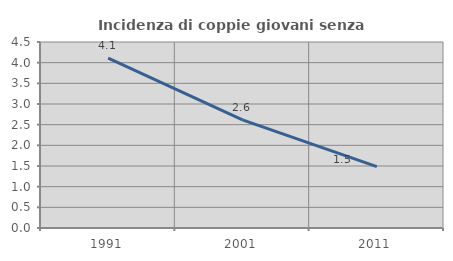
| Category | Incidenza di coppie giovani senza figli |
|---|---|
| 1991.0 | 4.11 |
| 2001.0 | 2.614 |
| 2011.0 | 1.484 |